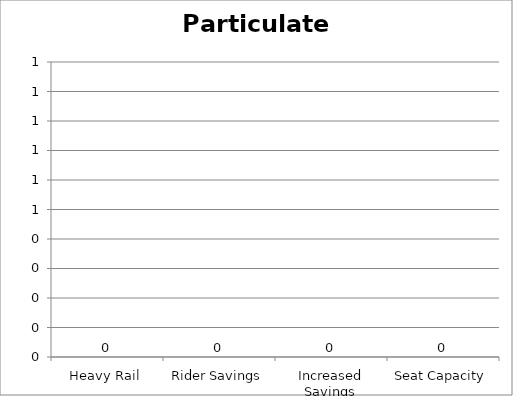
| Category | Particulate Matter |
|---|---|
| Heavy Rail | 0 |
| Rider Savings | 0 |
| Increased Savings | 0 |
| Seat Capacity | 0 |